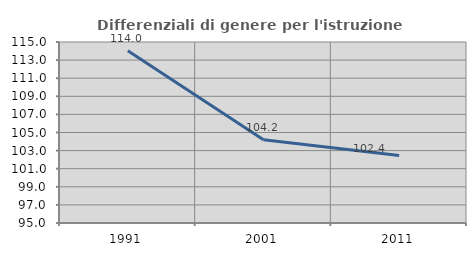
| Category | Differenziali di genere per l'istruzione superiore |
|---|---|
| 1991.0 | 114.04 |
| 2001.0 | 104.188 |
| 2011.0 | 102.446 |